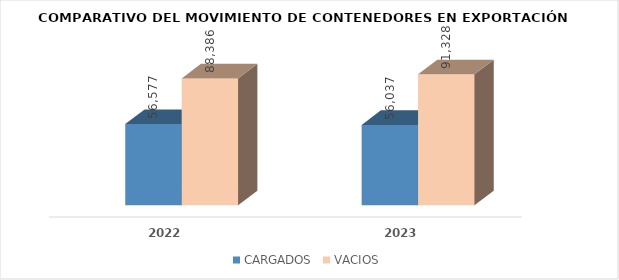
| Category | CARGADOS | VACIOS |
|---|---|---|
| 2022.0 | 56577 | 88386 |
| 2023.0 | 56036.75 | 91328.25 |